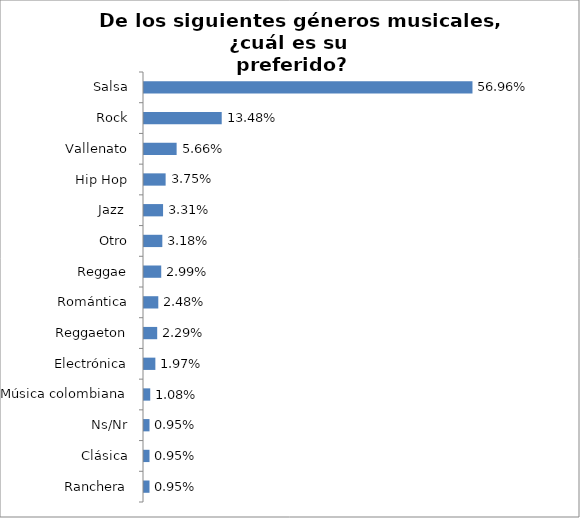
| Category | Total |
|---|---|
| Ranchera | 0.01 |
| Clásica | 0.01 |
| Ns/Nr | 0.01 |
| Música colombiana | 0.011 |
| Electrónica | 0.02 |
| Reggaeton | 0.023 |
| Romántica | 0.025 |
| Reggae | 0.03 |
| Otro | 0.032 |
| Jazz  | 0.033 |
| Hip Hop | 0.038 |
| Vallenato | 0.057 |
| Rock | 0.135 |
| Salsa | 0.57 |